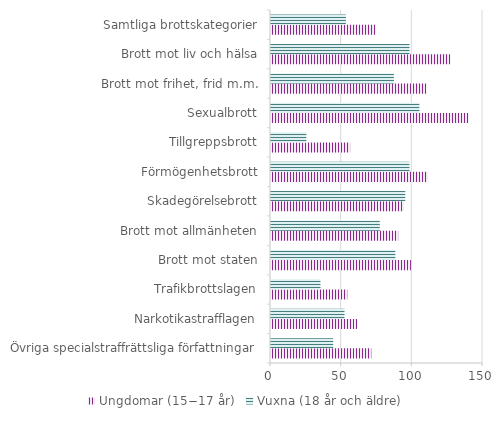
| Category | Ungdomar (15−17 år)  | Vuxna (18 år och äldre)  |
|---|---|---|
| Övriga specialstraffrättsliga författningar | 71 | 44 |
| Narkotikastrafflagen | 61 | 52 |
| Trafikbrottslagen | 54 | 35 |
| Brott mot staten | 99 | 88 |
| Brott mot allmänheten | 90 | 77 |
| Skadegörelsebrott | 94 | 95 |
| Förmögenhetsbrott | 111 | 98 |
| Tillgreppsbrott | 56 | 25 |
| Sexualbrott | 140 | 105 |
| Brott mot frihet, frid m.m. | 110 | 87 |
| Brott mot liv och hälsa | 127 | 98 |
| Samtliga brottskategorier | 74 | 53 |